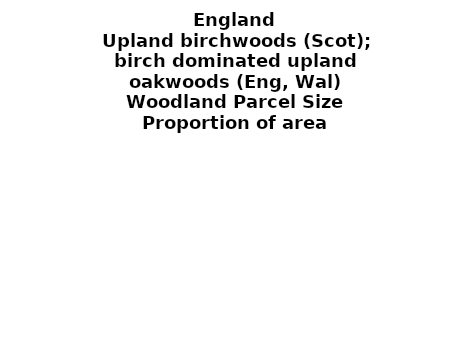
| Category | Upland birchwoods (Scot); birch dominated upland oakwoods (Eng, Wal) |
|---|---|
| <5 ha | 0.07 |
| ≥5 and <10 ha | 0.093 |
| ≥10 and <15 ha | 0.044 |
| ≥15 and <20 ha | 0.016 |
| ≥20 and <25 ha | 0.079 |
| ≥25 and <30 ha | 0.039 |
| ≥30 and <35 ha | 0.02 |
| ≥35 and <40 ha | 0 |
| ≥40 and <45 ha | 0.023 |
| ≥45 and <50 ha | 0.026 |
| ≥50 and <60 ha | 0.019 |
| ≥60 and <70 ha | 0.018 |
| ≥70 and <80 ha | 0.057 |
| ≥80 and <90 ha | 0 |
| ≥90 and <100 ha | 0.019 |
| ≥100 and <150 ha | 0.034 |
| ≥150 and <200 ha | 0.07 |
| ≥200 ha | 0.37 |